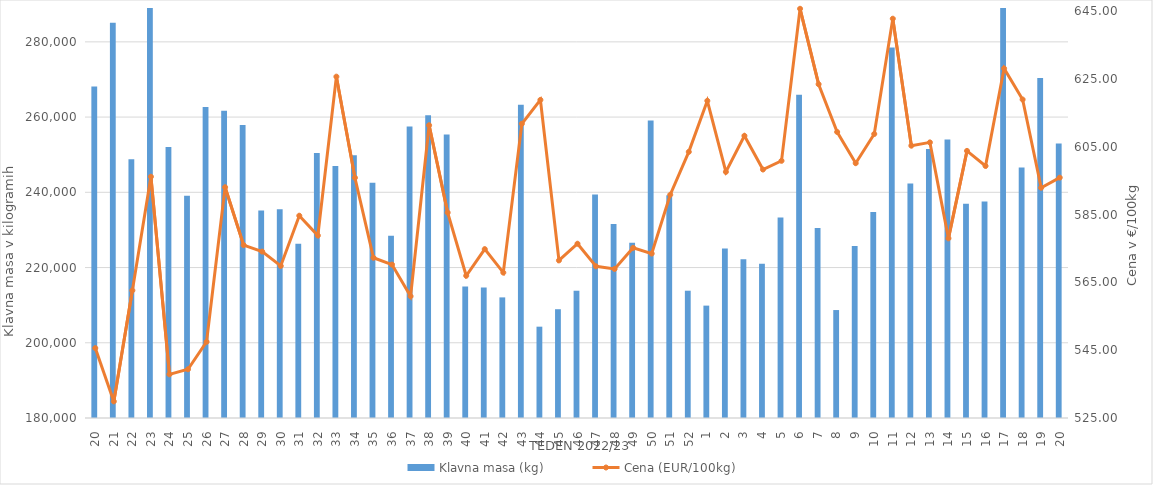
| Category | Klavna masa (kg) |
|---|---|
| 20.0 | 268153 |
| 21.0 | 285073 |
| 22.0 | 248783 |
| 23.0 | 289478 |
| 24.0 | 252069 |
| 25.0 | 239099 |
| 26.0 | 262689 |
| 27.0 | 261656 |
| 28.0 | 257905 |
| 29.0 | 235185 |
| 30.0 | 235475 |
| 31.0 | 226322 |
| 32.0 | 250418 |
| 33.0 | 246996 |
| 34.0 | 249873 |
| 35.0 | 242516 |
| 36.0 | 228469 |
| 37.0 | 257511 |
| 38.0 | 260481 |
| 39.0 | 255370 |
| 40.0 | 214936 |
| 41.0 | 214672 |
| 42.0 | 212066 |
| 43.0 | 263287 |
| 44.0 | 204280 |
| 45.0 | 208920 |
| 46.0 | 213836 |
| 47.0 | 239417 |
| 48.0 | 231565 |
| 49.0 | 226575 |
| 50.0 | 259073 |
| 51.0 | 239211 |
| 52.0 | 213841 |
| 1.0 | 209877 |
| 2.0 | 225045 |
| 3.0 | 222198 |
| 4.0 | 221002 |
| 5.0 | 233306 |
| 6.0 | 265944 |
| 7.0 | 230531 |
| 8.0 | 208699 |
| 9.0 | 225712 |
| 10.0 | 234762 |
| 11.0 | 278467 |
| 12.0 | 242369 |
| 13.0 | 251507 |
| 14.0 | 254072 |
| 15.0 | 236964 |
| 16.0 | 237552 |
| 17.0 | 289400 |
| 18.0 | 246616 |
| 19.0 | 270374 |
| 20.0 | 252984 |